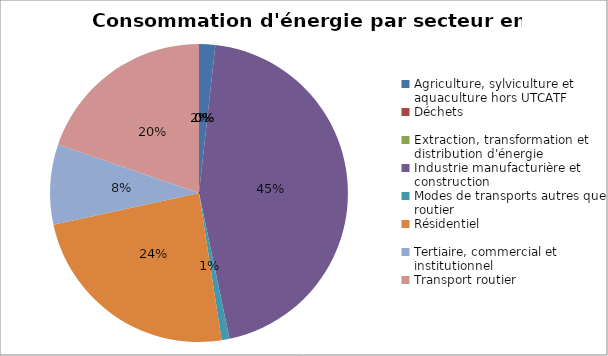
| Category | Series 0 |
|---|---|
| Agriculture, sylviculture et aquaculture hors UTCATF | 37509.929 |
| Déchets | 0 |
| Extraction, transformation et distribution d'énergie | 0 |
| Industrie manufacturière et construction | 959885.266 |
| Modes de transports autres que routier | 18243.645 |
| Résidentiel | 512584.559 |
| Tertiaire, commercial et institutionnel | 185752.026 |
| Transport routier | 421061.703 |